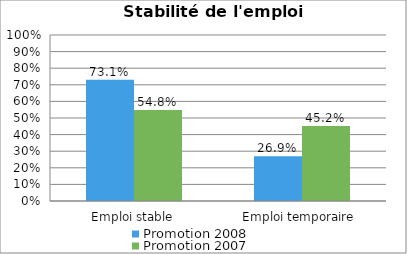
| Category | Promotion 2008 | Promotion 2007 |
|---|---|---|
| Emploi stable | 0.731 | 0.548 |
| Emploi temporaire  | 0.269 | 0.452 |